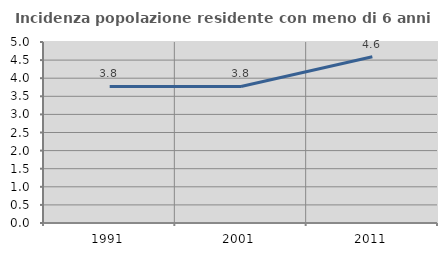
| Category | Incidenza popolazione residente con meno di 6 anni |
|---|---|
| 1991.0 | 3.772 |
| 2001.0 | 3.772 |
| 2011.0 | 4.591 |